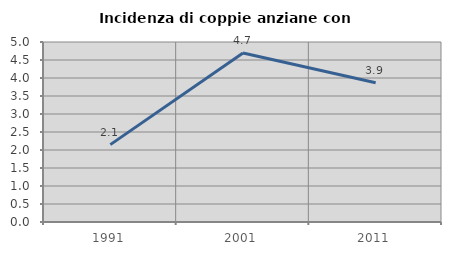
| Category | Incidenza di coppie anziane con figli |
|---|---|
| 1991.0 | 2.149 |
| 2001.0 | 4.693 |
| 2011.0 | 3.87 |